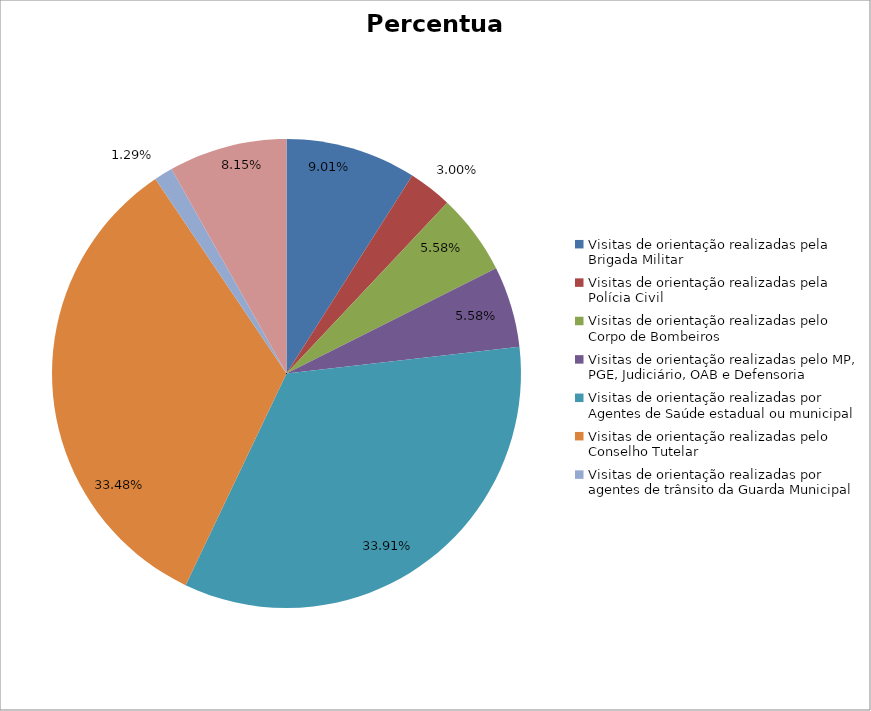
| Category | Percentual |
|---|---|
| Visitas de orientação realizadas pela Brigada Militar | 0.09 |
| Visitas de orientação realizadas pela Polícia Civil | 0.03 |
| Visitas de orientação realizadas pelo Corpo de Bombeiros | 0.056 |
| Visitas de orientação realizadas pelo MP, PGE, Judiciário, OAB e Defensoria | 0.056 |
| Visitas de orientação realizadas por Agentes de Saúde estadual ou municipal | 0.339 |
| Visitas de orientação realizadas pelo Conselho Tutelar | 0.335 |
| Visitas de orientação realizadas por agentes de trânsito da Guarda Municipal | 0.013 |
| Visitas de orientação realizadas por ONGs, entidades privadas, CRAS e CREAS | 0.082 |